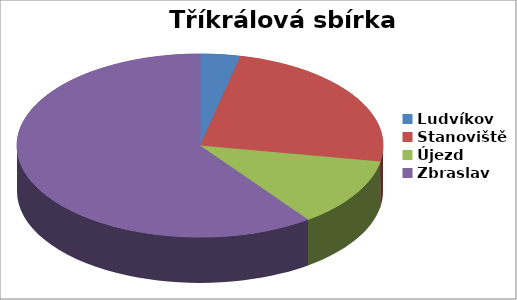
| Category | Series 0 |
|---|---|
| Ludvíkov | 3970 |
| Stanoviště | 27284 |
| Újezd | 13691 |
| Zbraslav | 67526 |